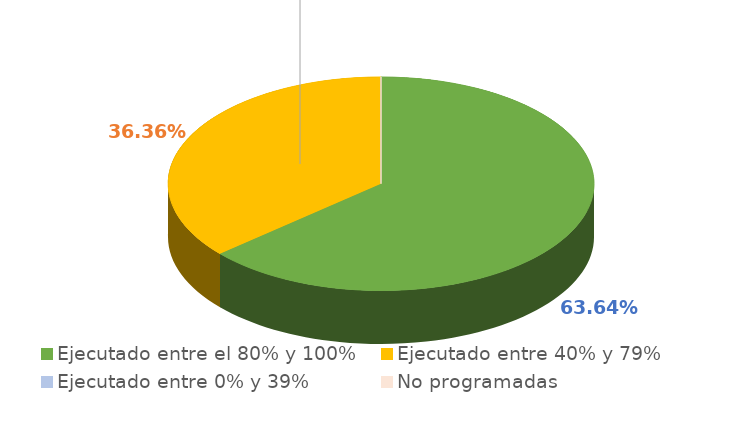
| Category | Series 0 |
|---|---|
| Ejecutado entre el 80% y 100% | 0.636 |
| Ejecutado entre 40% y 79% | 0.364 |
| Ejecutado entre 0% y 39% | 0 |
| No programadas | 0 |